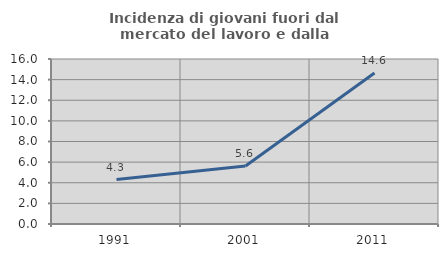
| Category | Incidenza di giovani fuori dal mercato del lavoro e dalla formazione  |
|---|---|
| 1991.0 | 4.31 |
| 2001.0 | 5.618 |
| 2011.0 | 14.634 |